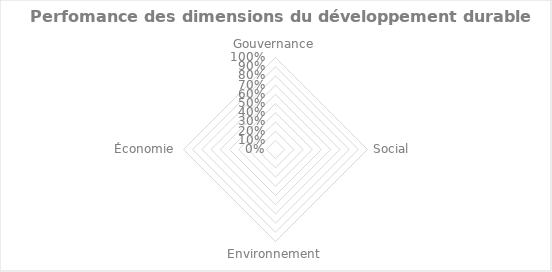
| Category | 0% |
|---|---|
| Gouvernance | 0 |
| Social | 0 |
| Environnement | 0 |
| Économie | 0 |